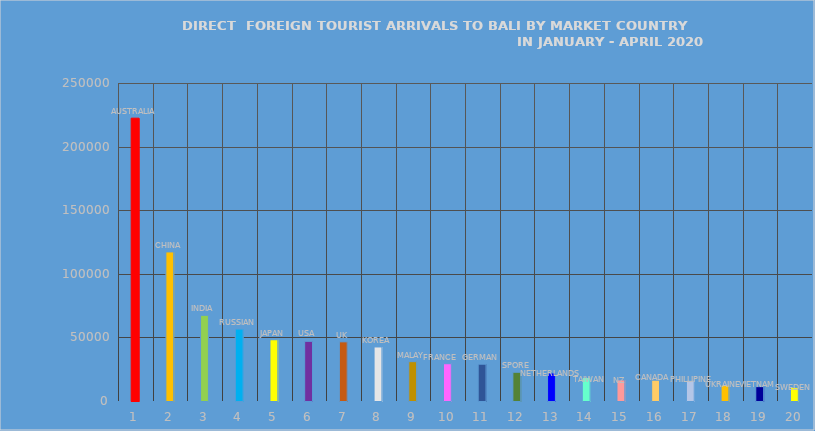
| Category | Series 0 |
|---|---|
| 0 | 222358 |
| 1 | 117202 |
| 2 | 67363 |
| 3 | 56563 |
| 4 | 48143 |
| 5 | 46924 |
| 6 | 46509 |
| 7 | 42487 |
| 8 | 30924 |
| 9 | 29301 |
| 10 | 28931 |
| 11 | 22600 |
| 12 | 22054 |
| 13 | 18491 |
| 14 | 16561 |
| 15 | 16365 |
| 16 | 16312 |
| 17 | 12527 |
| 18 | 11285 |
| 19 | 10700 |